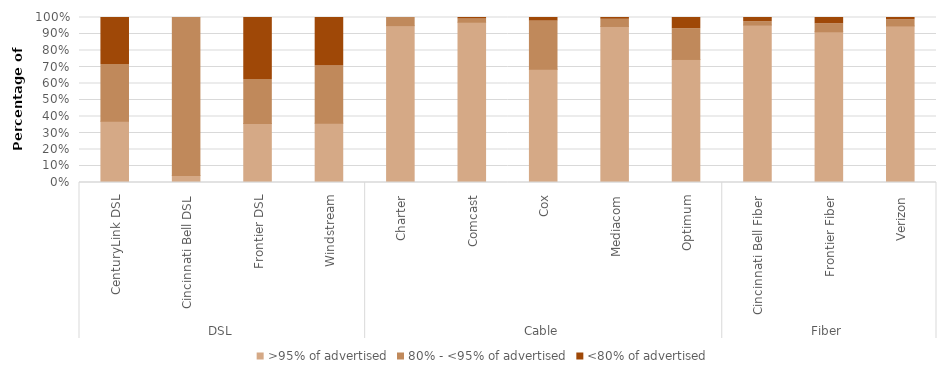
| Category | >95% of advertised | 80% - <95% of advertised | <80% of advertised |
|---|---|---|---|
| 0 | 0.371 | 0.344 | 0.285 |
| 1 | 0.043 | 0.957 | 0 |
| 2 | 0.358 | 0.266 | 0.376 |
| 3 | 0.359 | 0.347 | 0.293 |
| 4 | 0.951 | 0.049 | 0 |
| 5 | 0.972 | 0.019 | 0.009 |
| 6 | 0.687 | 0.291 | 0.022 |
| 7 | 0.946 | 0.043 | 0.011 |
| 8 | 0.746 | 0.186 | 0.068 |
| 9 | 0.954 | 0.02 | 0.026 |
| 10 | 0.913 | 0.048 | 0.038 |
| 11 | 0.949 | 0.036 | 0.015 |